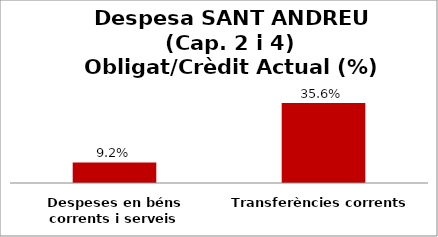
| Category | Series 0 |
|---|---|
| Despeses en béns corrents i serveis | 0.092 |
| Transferències corrents | 0.356 |